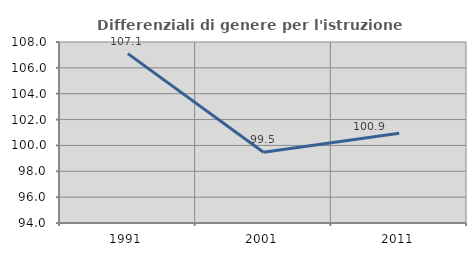
| Category | Differenziali di genere per l'istruzione superiore |
|---|---|
| 1991.0 | 107.1 |
| 2001.0 | 99.476 |
| 2011.0 | 100.938 |